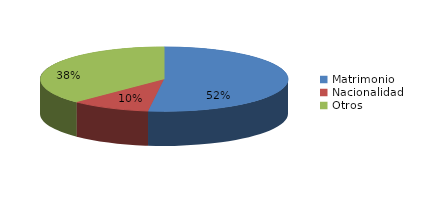
| Category | Series 0 |
|---|---|
| Matrimonio | 753 |
| Nacionalidad | 150 |
| Otros | 544 |